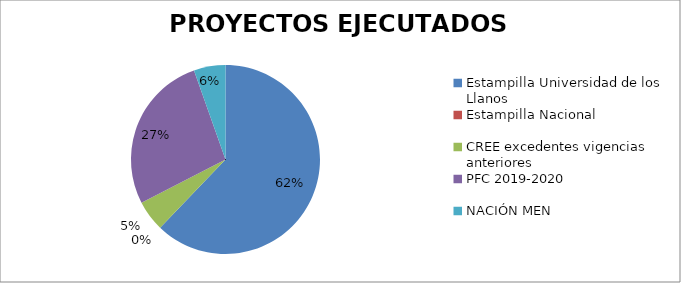
| Category | EJECUTADO R.P |
|---|---|
| Estampilla Universidad de los Llanos | 5596789957 |
| Estampilla Nacional | 0 |
| CREE excedentes vigencias anteriores | 475625534 |
| PFC 2019-2020 | 2444350244 |
| NACIÓN MEN | 487000000 |